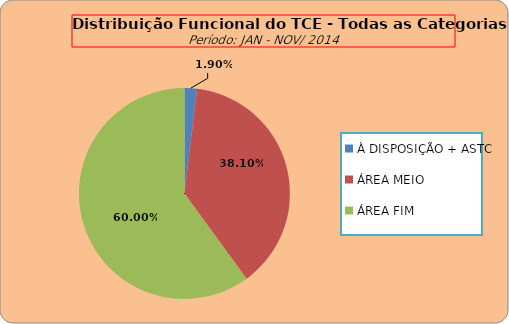
| Category | ÁREAS DE ATUAÇÃO |
|---|---|
| À DISPOSIÇÃO + ASTC | 10 |
| ÁREA MEIO | 200 |
| ÁREA FIM | 315 |